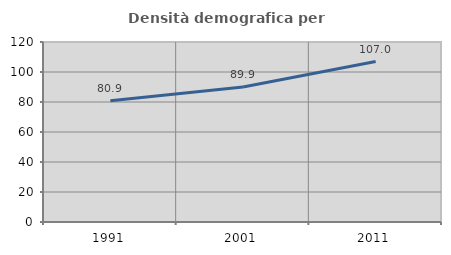
| Category | Densità demografica |
|---|---|
| 1991.0 | 80.91 |
| 2001.0 | 89.942 |
| 2011.0 | 106.96 |